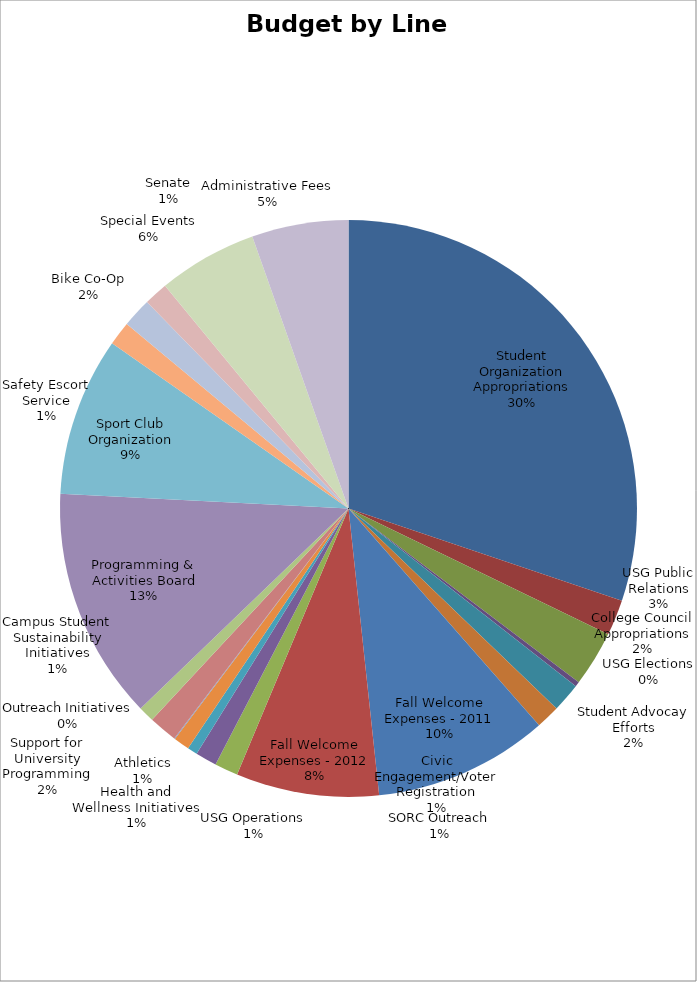
| Category | Budget by Line Item |
|---|---|
| Student Organization Appropriations | 678294.24 |
| College Council Appropriations | 45105.76 |
| USG Public Relations | 70000 |
| USG Elections | 6000 |
| Student Advocay Efforts | 36500 |
| Civic Engagement/Voter Registration | 30000 |
| Fall Welcome Expenses - 2011 | 220000 |
| Fall Welcome Expenses - 2012 | 180000 |
| SORC Outreach | 29500 |
| Health and Wellness Initiatives | 27000 |
| USG Operations | 12650 |
| Athletics | 20000 |
| Outreach Initiatives | 1000 |
| Support for University Programming | 36000 |
| Campus Student Sustainability Initiatives | 20000 |
| Programming & Activities Board | 292300 |
| Sport Club Organization | 200000 |
| Safety Escort Service | 30000 |
| Bike Co-Op | 37000 |
| Senate | 30050 |
| Special Events | 125000 |
| Administrative Fees | 121600 |